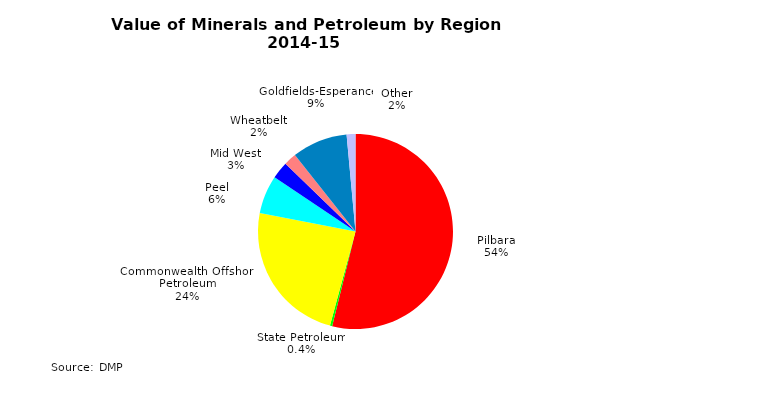
| Category | Series 0 |
|---|---|
| Pilbara | 53596887347 |
| State Petroleum | 362371401 |
| Commonwealth Offshore Petroleum | 23690681243 |
| Peel | 6358279481 |
| Mid West | 2826783011 |
| Wheatbelt | 2069057735 |
| Goldfields-Esperance | 9163778978 |
| Other | 1455064119 |